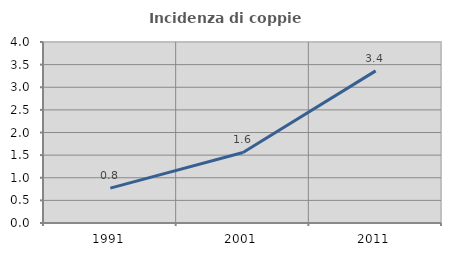
| Category | Incidenza di coppie miste |
|---|---|
| 1991.0 | 0.771 |
| 2001.0 | 1.559 |
| 2011.0 | 3.361 |